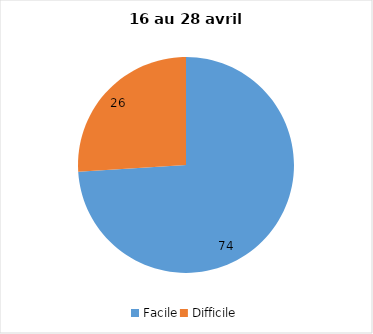
| Category | Series 0 |
|---|---|
| Facile | 74 |
| Difficile | 26 |